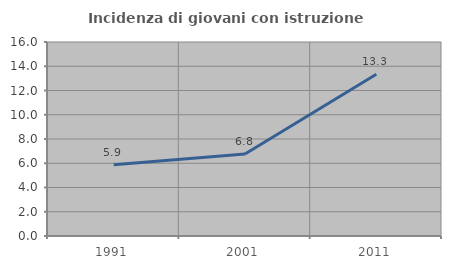
| Category | Incidenza di giovani con istruzione universitaria |
|---|---|
| 1991.0 | 5.882 |
| 2001.0 | 6.757 |
| 2011.0 | 13.333 |